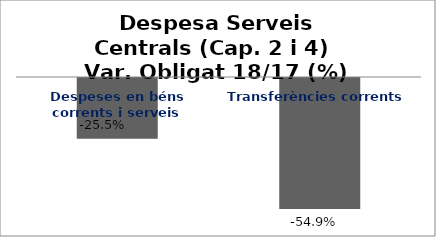
| Category | Series 0 |
|---|---|
| Despeses en béns corrents i serveis | -0.255 |
| Transferències corrents | -0.549 |